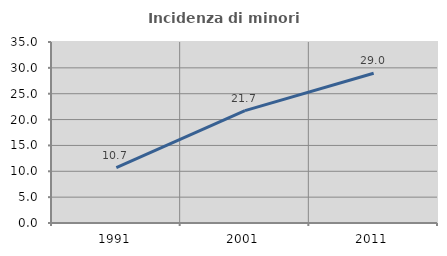
| Category | Incidenza di minori stranieri |
|---|---|
| 1991.0 | 10.714 |
| 2001.0 | 21.739 |
| 2011.0 | 28.953 |